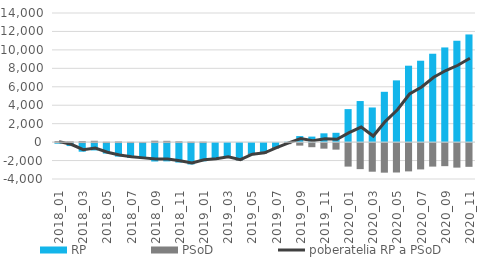
| Category | RP | PSoD |
|---|---|---|
| 2018_01 | -62 | 118 |
| 2018_02 | -321 | 88 |
| 2018_03 | -931 | 110 |
| 2018_04 | -794 | 144 |
| 2018_05 | -1133 | 41 |
| 2018_06 | -1461 | 71 |
| 2018_07 | -1614 | 27 |
| 2018_08 | -1716 | 6 |
| 2018_09 | -1994 | 151 |
| 2018_10 | -1980 | 139 |
| 2018_11 | -2108 | 89 |
| 2018_12 | -2312 | 48 |
| 2019_01 | -1976 | 52 |
| 2019_02 | -1792 | -14 |
| 2019_03 | -1560 | -40 |
| 2019_04 | -1856 | -40 |
| 2019_05 | -1241 | -66 |
| 2019_06 | -1047 | -116 |
| 2019_07 | -523 | -73 |
| 2019_08 | 41 | -115 |
| 2019_09 | 654 | -272 |
| 2019_10 | 598 | -444 |
| 2019_11 | 953 | -601 |
| 2019_12 | 1009 | -708 |
| 2020_01 | 3579 | -2547 |
| 2020_02 | 4454 | -2822 |
| 2020_03 | 3755 | -3100 |
| 2020_04 | 5455 | -3204 |
| 2020_05 | 6694 | -3187 |
| 2020_06 | 8286 | -3066 |
| 2020_07 | 8826 | -2852 |
| 2020_08 | 9583 | -2548 |
| 2020_09 | 10265 | -2500 |
| 2020_10 | 10991 | -2658 |
| 2020_11 | 11674 | -2572 |